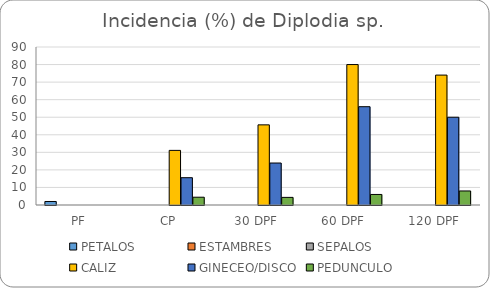
| Category | PETALOS  | ESTAMBRES | SEPALOS | CALIZ  | GINECEO/DISCO | PEDUNCULO |
|---|---|---|---|---|---|---|
| PF | 2 | 0 | 0 | 0 | 0 | 0 |
| CP | 0 | 0 | 0 | 31.11 | 15.55 | 4.44 |
| 30 DPF | 0 | 0 | 0 | 45.65 | 23.91 | 4.34 |
| 60 DPF  | 0 | 0 | 0 | 80 | 56 | 6 |
| 120 DPF | 0 | 0 | 0 | 74 | 50 | 8 |